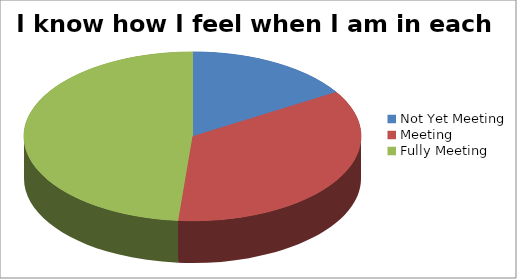
| Category | I know how I feel when I am in each zone |
|---|---|
| Not Yet Meeting | 6 |
| Meeting | 13 |
| Fully Meeting | 18 |